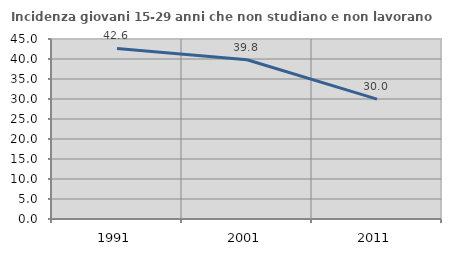
| Category | Incidenza giovani 15-29 anni che non studiano e non lavorano  |
|---|---|
| 1991.0 | 42.629 |
| 2001.0 | 39.818 |
| 2011.0 | 29.983 |